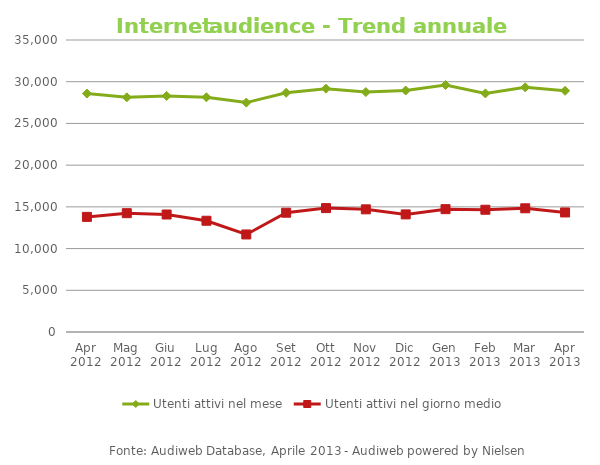
| Category | Utenti attivi nel mese | Utenti attivi nel giorno medio |
|---|---|---|
| Apr 2012 | 28580 | 13798 |
| Mag 2012 | 28130 | 14243 |
| Giu 2012 | 28296 | 14083 |
| Lug 2012 | 28139 | 13336 |
| Ago 2012 | 27497 | 11692 |
| Set 2012 | 28677 | 14298 |
| Ott 2012 | 29166 | 14851 |
| Nov 2012 | 28757 | 14702 |
| Dic 2012 | 28943 | 14096 |
| Gen 2013 | 29605 | 14726 |
| Feb 2013 | 28599 | 14655 |
| Mar 2013 | 29329 | 14829 |
| Apr 2013 | 28913 | 14328 |